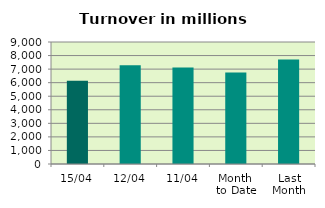
| Category | Series 0 |
|---|---|
| 15/04 | 6134.183 |
| 12/04 | 7293.531 |
| 11/04 | 7121.528 |
| Month 
to Date | 6747.489 |
| Last
Month | 7711.184 |